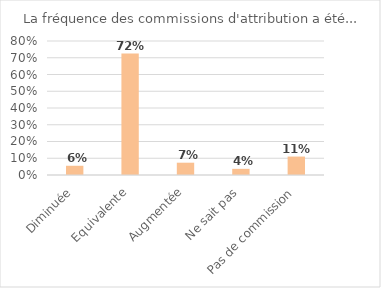
| Category | Series 0 |
|---|---|
| Diminuée | 0.055 |
| Equivalente | 0.725 |
| Augmentée | 0.073 |
| Ne sait pas | 0.037 |
| Pas de commission | 0.11 |